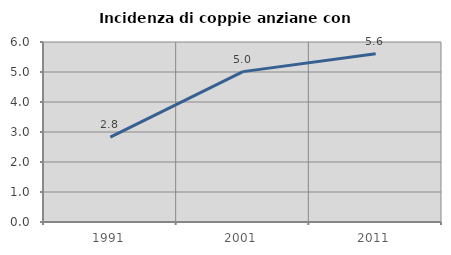
| Category | Incidenza di coppie anziane con figli |
|---|---|
| 1991.0 | 2.829 |
| 2001.0 | 5.012 |
| 2011.0 | 5.609 |